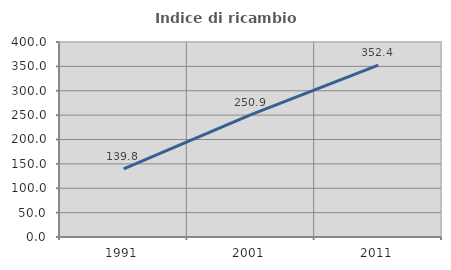
| Category | Indice di ricambio occupazionale  |
|---|---|
| 1991.0 | 139.831 |
| 2001.0 | 250.909 |
| 2011.0 | 352.381 |